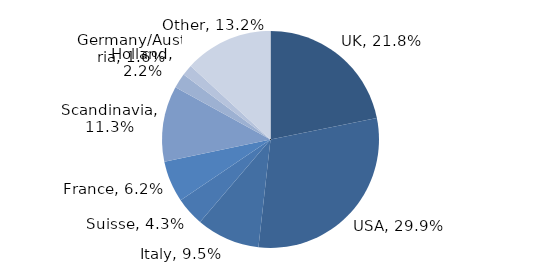
| Category | Investment Style |
|---|---|
| UK | 0.218 |
| USA | 0.299 |
| Italy | 0.095 |
| Suisse | 0.043 |
| France | 0.062 |
| Scandinavia | 0.113 |
| Holland | 0.022 |
| Germany/Austria | 0.016 |
| Other | 0.132 |